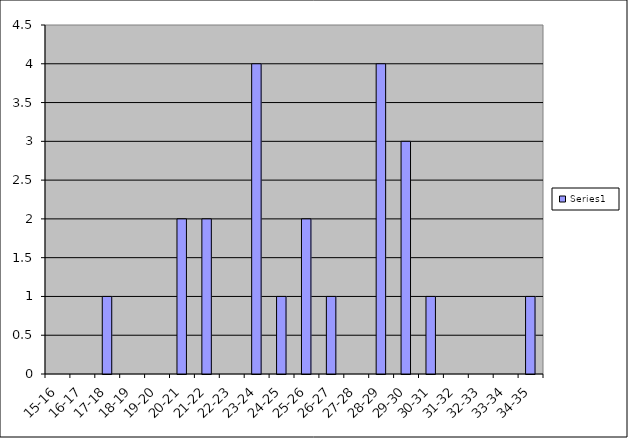
| Category | Series 0 |
|---|---|
| 15-16 | 0 |
| 16-17 | 0 |
| 17-18 | 1 |
| 18-19 | 0 |
| 19-20 | 0 |
| 20-21 | 2 |
| 21-22 | 2 |
| 22-23 | 0 |
| 23-24 | 4 |
| 24-25 | 1 |
| 25-26 | 2 |
| 26-27 | 1 |
| 27-28 | 0 |
| 28-29 | 4 |
| 29-30 | 3 |
| 30-31 | 1 |
| 31-32 | 0 |
| 32-33 | 0 |
| 33-34 | 0 |
| 34-35 | 1 |